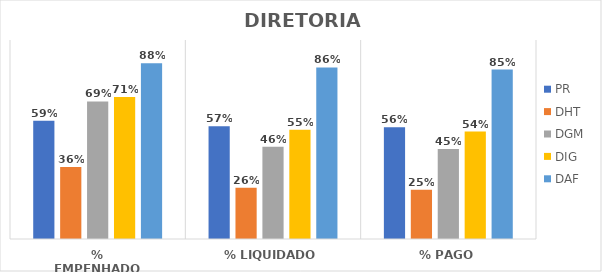
| Category | PR | DHT | DGM | DIG | DAF |
|---|---|---|---|---|---|
| % EMPENHADO | 0.594 | 0.362 | 0.691 | 0.714 | 0.883 |
| % LIQUIDADO | 0.566 | 0.258 | 0.463 | 0.549 | 0.862 |
| % PAGO | 0.562 | 0.247 | 0.453 | 0.54 | 0.851 |